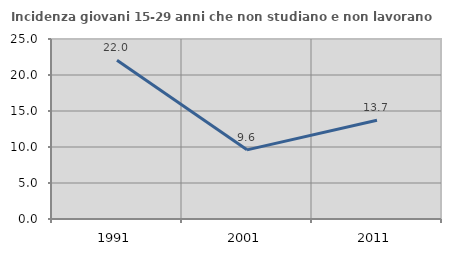
| Category | Incidenza giovani 15-29 anni che non studiano e non lavorano  |
|---|---|
| 1991.0 | 22.034 |
| 2001.0 | 9.605 |
| 2011.0 | 13.708 |